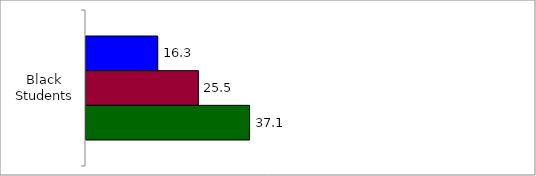
| Category | 50 States and D.C. | SREB States | State |
|---|---|---|---|
| 0 | 16.274 | 25.488 | 37.095 |